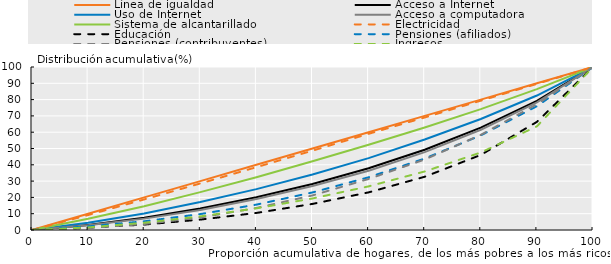
| Category | Línea de igualdad | Acceso a Internet | Uso de Internet | Acceso a computadora | Sistema de alcantarillado | Electricidad | Educación | Pensiones (afiliados) | Pensiones (contribuyentes) | Ingresos |
|---|---|---|---|---|---|---|---|---|---|---|
| 0.0 | 0 | 0 | 0 | 0 | 0 | 0 | 0 | 0 | 0 | 0 |
| 10.0 | 10 | 3.124 | 4.389 | 2.982 | 6.885 | 9.157 | 1.451 | 2.217 | 1.155 | 1.583 |
| 20.0 | 20 | 7.473 | 10.112 | 6.978 | 14.585 | 18.761 | 3.325 | 5.344 | 3.663 | 4.465 |
| 30.0 | 30 | 13.227 | 17.154 | 12.336 | 23.23 | 28.552 | 6.38 | 9.767 | 7.634 | 8.359 |
| 40.0 | 40 | 20.103 | 25.085 | 19.02 | 32.351 | 38.535 | 10.47 | 15.563 | 13.503 | 13.286 |
| 50.0 | 50 | 28.262 | 34.082 | 26.991 | 42.149 | 48.684 | 16.009 | 23.049 | 21.225 | 19.35 |
| 60.0 | 60 | 37.844 | 44.108 | 36.369 | 52.328 | 59.001 | 23.087 | 32.348 | 31.296 | 26.768 |
| 70.0 | 70 | 49.233 | 55.504 | 47.781 | 62.902 | 69.04 | 32.665 | 43.865 | 43.237 | 35.917 |
| 80.0 | 80 | 62.836 | 68.116 | 61.525 | 74.149 | 79.325 | 46.057 | 58.045 | 58.38 | 47.554 |
| 90.0 | 90 | 79.268 | 82.502 | 78.335 | 86.406 | 89.645 | 66.325 | 75.941 | 77.152 | 63.586 |
| 100.0 | 100 | 100 | 100 | 100 | 100 | 100 | 100 | 100 | 100 | 100 |